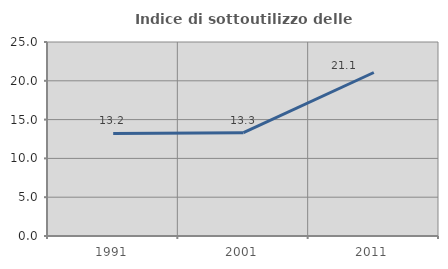
| Category | Indice di sottoutilizzo delle abitazioni  |
|---|---|
| 1991.0 | 13.223 |
| 2001.0 | 13.309 |
| 2011.0 | 21.07 |